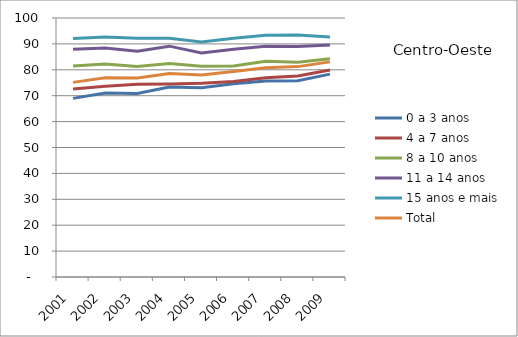
| Category | 0 a 3 anos | 4 a 7 anos | 8 a 10 anos | 11 a 14 anos | 15 anos e mais | Total |
|---|---|---|---|---|---|---|
| 2001.0 | 68.97 | 72.59 | 81.51 | 87.96 | 92.07 | 75.15 |
| 2002.0 | 71.03 | 73.68 | 82.26 | 88.42 | 92.68 | 76.91 |
| 2003.0 | 70.89 | 74.38 | 81.3 | 87.15 | 92.17 | 76.86 |
| 2004.0 | 73.39 | 74.54 | 82.47 | 89.13 | 92.18 | 78.56 |
| 2005.0 | 73.06 | 74.76 | 81.38 | 86.5 | 90.73 | 78.03 |
| 2006.0 | 74.61 | 75.44 | 81.5 | 87.89 | 92.19 | 79.33 |
| 2007.0 | 75.67 | 76.92 | 83.33 | 89.08 | 93.32 | 80.83 |
| 2008.0 | 75.77 | 77.58 | 82.91 | 88.95 | 93.41 | 81.23 |
| 2009.0 | 78.33 | 79.93 | 84.24 | 89.53 | 92.69 | 83.06 |